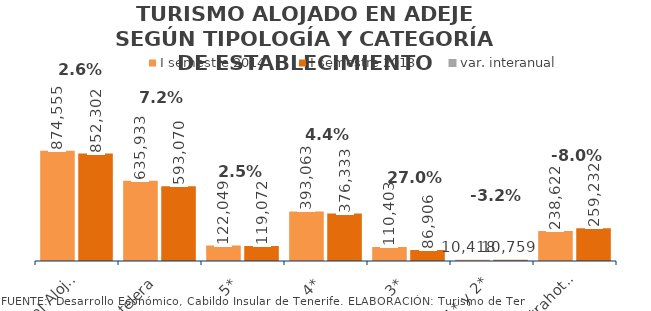
| Category | I semestre 2014 | I semestre 2013 |
|---|---|---|
| Total Alojados | 874555 | 852302 |
| Hotelera | 635933 | 593070 |
| 5* | 122049 | 119072 |
| 4* | 393063 | 376333 |
| 3* | 110403 | 86906 |
| 1* y 2* | 10418 | 10759 |
| Extrahotelera | 238622 | 259232 |